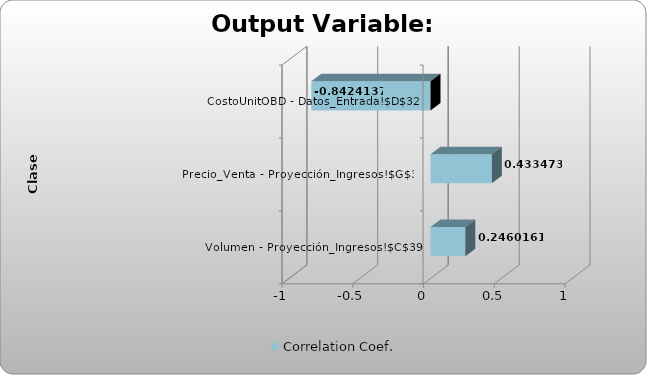
| Category | Correlation Coef. |
|---|---|
| Volumen - Proyección_Ingresos!$C$39 | 0.246 |
| Precio_Venta - Proyección_Ingresos!$G$39 | 0.433 |
| CostoUnitOBD - Datos_Entrada!$D$32 | -0.842 |